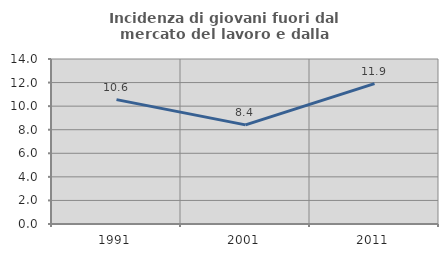
| Category | Incidenza di giovani fuori dal mercato del lavoro e dalla formazione  |
|---|---|
| 1991.0 | 10.552 |
| 2001.0 | 8.409 |
| 2011.0 | 11.911 |